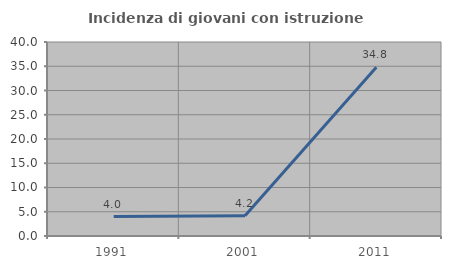
| Category | Incidenza di giovani con istruzione universitaria |
|---|---|
| 1991.0 | 4 |
| 2001.0 | 4.167 |
| 2011.0 | 34.783 |